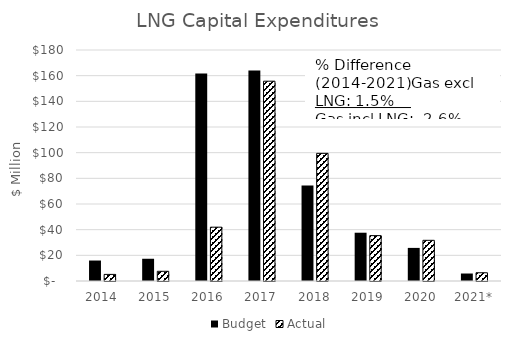
| Category | Budget | Actual |
|---|---|---|
| 2014 | 15.953 | 5.148 |
| 2015 | 17.33 | 7.558 |
| 2016 | 161.601 | 41.94 |
| 2017 | 163.955 | 155.697 |
| 2018 | 74.329 | 99.461 |
| 2019 | 37.621 | 35.361 |
| 2020 | 25.791 | 31.7 |
| 2021* | 5.832 | 6.424 |